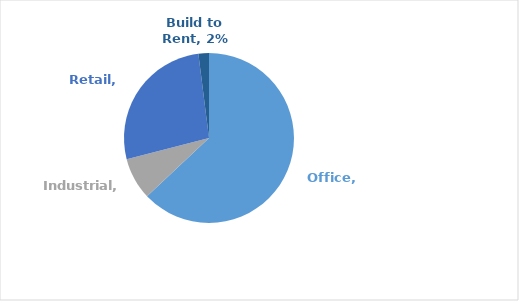
| Category | Series 0 |
|---|---|
| Office | 0.63 |
| Industrial | 0.08 |
| Retail | 0.27 |
| Build to Rent | 0.02 |